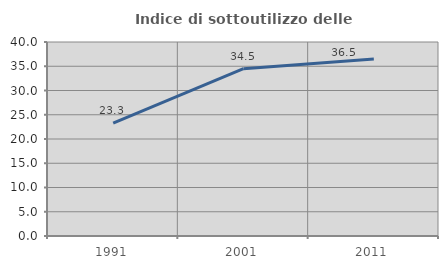
| Category | Indice di sottoutilizzo delle abitazioni  |
|---|---|
| 1991.0 | 23.286 |
| 2001.0 | 34.501 |
| 2011.0 | 36.472 |